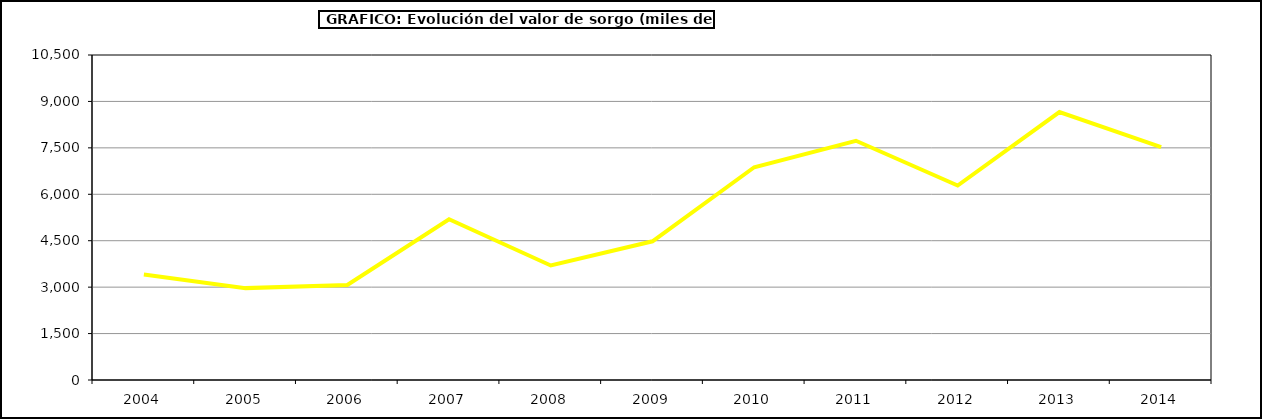
| Category | Producción |
|---|---|
| 2004.0 | 3411.843 |
| 2005.0 | 2968.37 |
| 2006.0 | 3071.694 |
| 2007.0 | 5192.201 |
| 2008.0 | 3699.984 |
| 2009.0 | 4481.299 |
| 2010.0 | 6873.468 |
| 2011.0 | 7728.6 |
| 2012.0 | 6283.71 |
| 2013.0 | 8656.32 |
| 2014.0 | 7525 |